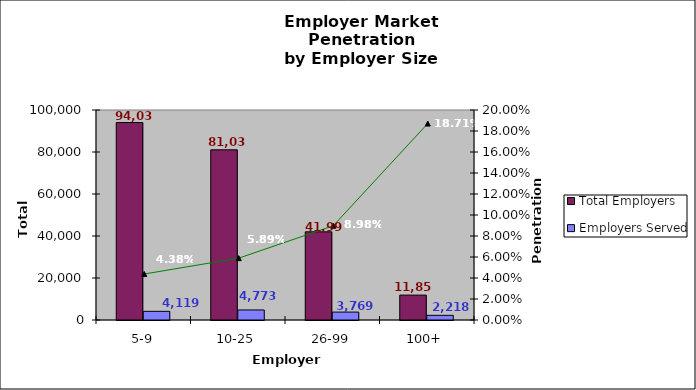
| Category | Total Employers | Employers Served |
|---|---|---|
| 5-9 | 94037 | 4119 |
| 10-25 | 81032 | 4773 |
| 26-99 | 41990 | 3769 |
| 100+ | 11855 | 2218 |